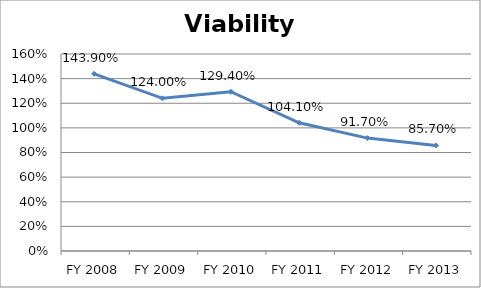
| Category | Viability ratio |
|---|---|
| FY 2013 | 0.857 |
| FY 2012 | 0.917 |
| FY 2011 | 1.041 |
| FY 2010 | 1.294 |
| FY 2009 | 1.24 |
| FY 2008 | 1.439 |